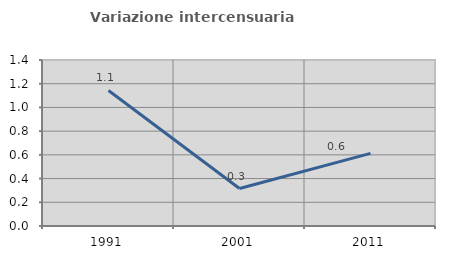
| Category | Variazione intercensuaria annua |
|---|---|
| 1991.0 | 1.143 |
| 2001.0 | 0.316 |
| 2011.0 | 0.613 |